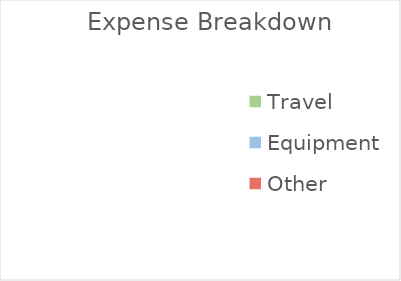
| Category | Expenses |
|---|---|
| Travel | 0 |
| Equipment | 0 |
| Other | 0 |